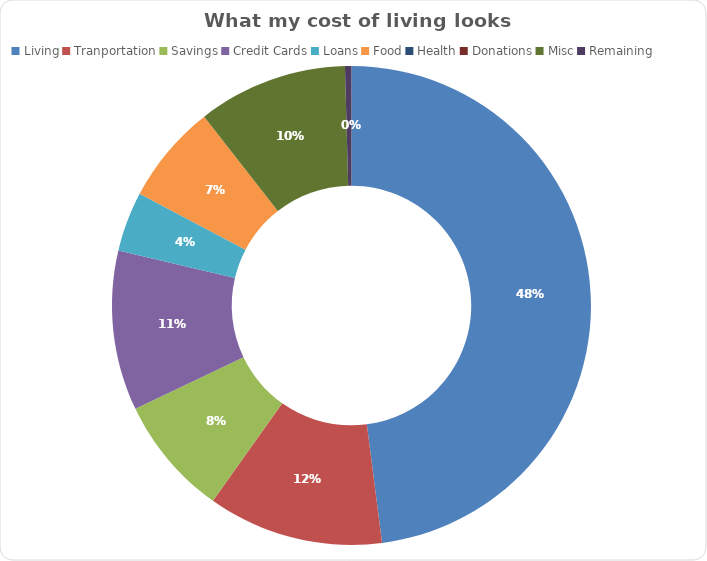
| Category | Living |
|---|---|
| Living | 21360 |
| Tranportation | 5280 |
| Savings | 3600 |
| Credit Cards | 4800 |
| Loans | 1800 |
| Food | 3000 |
| Health | 0 |
| Donations | 0 |
| Misc | 4500 |
| Remaining | -195 |